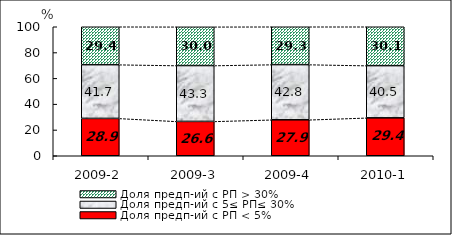
| Category | Доля предп-ий с РП < 5% | Доля предп-ий с 5≤ РП≤ 30% | Доля предп-ий с РП > 30% |
|---|---|---|---|
| 2009-2 | 28.94 | 41.66 | 29.4 |
| 2009-3 | 26.63 | 43.3 | 30.01 |
| 2009-4 | 27.88 | 42.78 | 29.34 |
| 2010-1 | 29.39 | 40.48 | 30.13 |